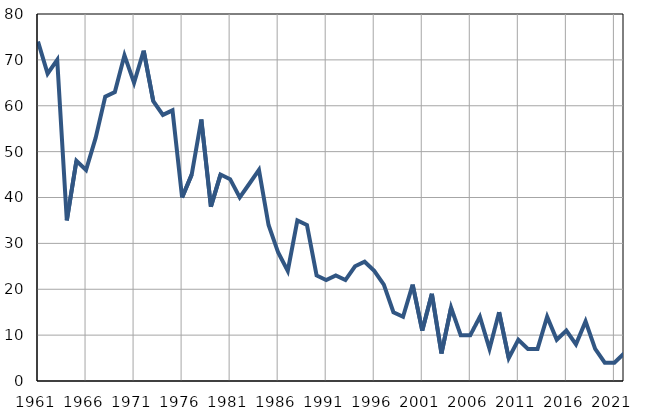
| Category | Infants
deaths |
|---|---|
| 1961.0 | 74 |
| 1962.0 | 67 |
| 1963.0 | 70 |
| 1964.0 | 35 |
| 1965.0 | 48 |
| 1966.0 | 46 |
| 1967.0 | 53 |
| 1968.0 | 62 |
| 1969.0 | 63 |
| 1970.0 | 71 |
| 1971.0 | 65 |
| 1972.0 | 72 |
| 1973.0 | 61 |
| 1974.0 | 58 |
| 1975.0 | 59 |
| 1976.0 | 40 |
| 1977.0 | 45 |
| 1978.0 | 57 |
| 1979.0 | 38 |
| 1980.0 | 45 |
| 1981.0 | 44 |
| 1982.0 | 40 |
| 1983.0 | 43 |
| 1984.0 | 46 |
| 1985.0 | 34 |
| 1986.0 | 28 |
| 1987.0 | 24 |
| 1988.0 | 35 |
| 1989.0 | 34 |
| 1990.0 | 23 |
| 1991.0 | 22 |
| 1992.0 | 23 |
| 1993.0 | 22 |
| 1994.0 | 25 |
| 1995.0 | 26 |
| 1996.0 | 24 |
| 1997.0 | 21 |
| 1998.0 | 15 |
| 1999.0 | 14 |
| 2000.0 | 21 |
| 2001.0 | 11 |
| 2002.0 | 19 |
| 2003.0 | 6 |
| 2004.0 | 16 |
| 2005.0 | 10 |
| 2006.0 | 10 |
| 2007.0 | 14 |
| 2008.0 | 7 |
| 2009.0 | 15 |
| 2010.0 | 5 |
| 2011.0 | 9 |
| 2012.0 | 7 |
| 2013.0 | 7 |
| 2014.0 | 14 |
| 2015.0 | 9 |
| 2016.0 | 11 |
| 2017.0 | 8 |
| 2018.0 | 13 |
| 2019.0 | 7 |
| 2020.0 | 4 |
| 2021.0 | 4 |
| 2022.0 | 6 |